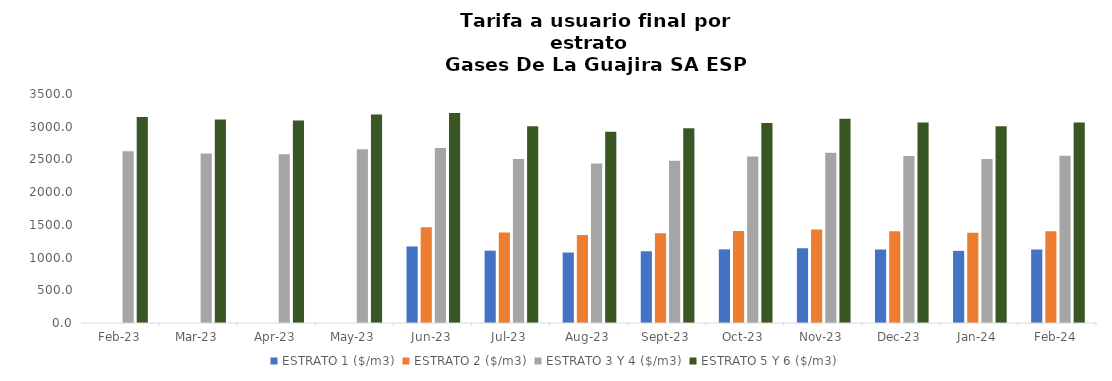
| Category | ESTRATO 1 ($/m3) | ESTRATO 2 ($/m3) | ESTRATO 3 Y 4 ($/m3) | ESTRATO 5 Y 6 ($/m3) |
|---|---|---|---|---|
| 2023-02-01 | 0 | 0 | 2623.2 | 3147.84 |
| 2023-03-01 | 0 | 0 | 2590.74 | 3108.888 |
| 2023-04-01 | 0 | 0 | 2580.05 | 3096.06 |
| 2023-05-01 | 0 | 0 | 2656.89 | 3188.268 |
| 2023-06-01 | 1169.58 | 1461.63 | 2673.91 | 3208.692 |
| 2023-07-01 | 1106 | 1382.28 | 2506.8 | 3008.16 |
| 2023-08-01 | 1077.22 | 1345.91 | 2436.6 | 2923.92 |
| 2023-09-01 | 1096.44 | 1370.32 | 2481.1 | 2977.32 |
| 2023-10-01 | 1125.72 | 1407.25 | 2546.63 | 3055.956 |
| 2023-11-01 | 1142.78 | 1427.17 | 2601.21 | 3121.452 |
| 2023-12-01 | 1121.82 | 1401.58 | 2553.75 | 3064.5 |
| 2024-01-01 | 1102.29 | 1377.46 | 2505.08 | 3006.096 |
| 2024-02-01 | 1123.4 | 1403.06 | 2554.39 | 3065.268 |